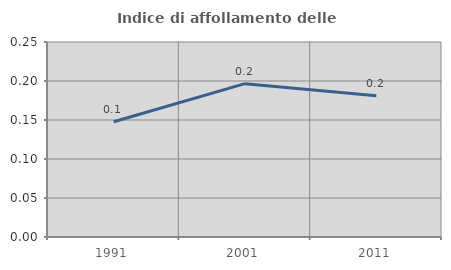
| Category | Indice di affollamento delle abitazioni  |
|---|---|
| 1991.0 | 0.148 |
| 2001.0 | 0.197 |
| 2011.0 | 0.181 |